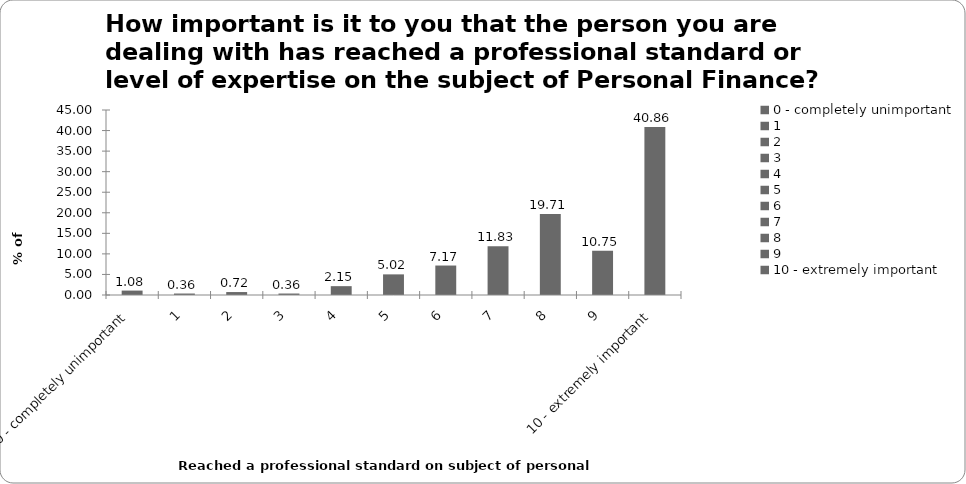
| Category | % of Respondents |
|---|---|
| 0 - completely unimportant | 1.075 |
| 1 | 0.358 |
| 2 | 0.717 |
| 3 | 0.358 |
| 4 | 2.151 |
| 5 | 5.018 |
| 6 | 7.168 |
| 7 | 11.828 |
| 8 | 19.713 |
| 9 | 10.753 |
| 10 - extremely important | 40.86 |